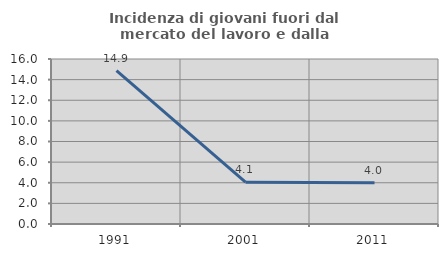
| Category | Incidenza di giovani fuori dal mercato del lavoro e dalla formazione  |
|---|---|
| 1991.0 | 14.865 |
| 2001.0 | 4.054 |
| 2011.0 | 4 |